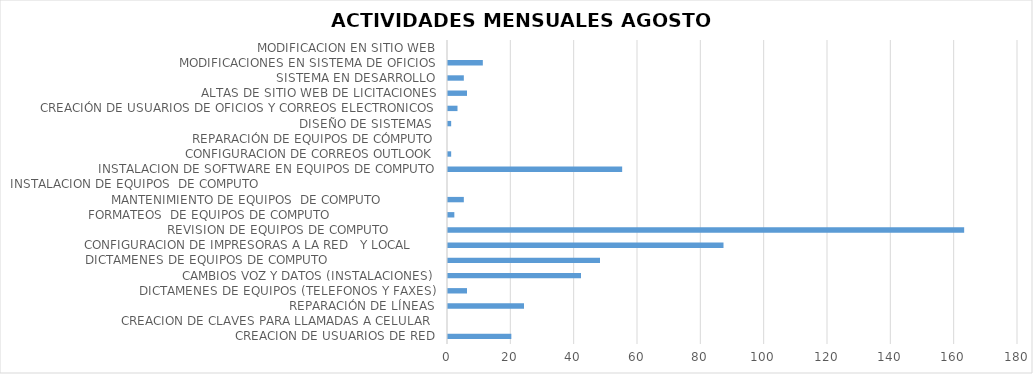
| Category | Series 0 |
|---|---|
| CREACION DE USUARIOS DE RED | 20 |
| CREACION DE CLAVES PARA LLAMADAS A CELULAR  | 0 |
| REPARACIÓN DE LÍNEAS | 24 |
| DICTAMENES DE EQUIPOS (TELEFONOS Y FAXES) | 6 |
| CAMBIOS VOZ Y DATOS (INSTALACIONES) | 42 |
| DICTAMENES DE EQUIPOS DE COMPUTO                             | 48 |
| CONFIGURACION DE IMPRESORAS A LA RED   Y LOCAL       | 87 |
| REVISION DE EQUIPOS DE COMPUTO             | 163 |
| FORMATEOS  DE EQUIPOS DE COMPUTO                            | 2 |
| MANTENIMIENTO DE EQUIPOS  DE COMPUTO               | 5 |
| INSTALACION DE EQUIPOS  DE COMPUTO                                               | 0 |
| INSTALACION DE SOFTWARE EN EQUIPOS DE COMPUTO | 55 |
| CONFIGURACION DE CORREOS OUTLOOK | 1 |
| REPARACIÓN DE EQUIPOS DE CÓMPUTO | 0 |
| DISEÑO DE SISTEMAS  | 1 |
| CREACIÓN DE USUARIOS DE OFICIOS Y CORREOS ELECTRONICOS | 3 |
| ALTAS DE SITIO WEB DE LICITACIONES | 6 |
| SISTEMA EN DESARROLLO | 5 |
| MODIFICACIONES EN SISTEMA DE OFICIOS | 11 |
| MODIFICACION EN SITIO WEB | 0 |